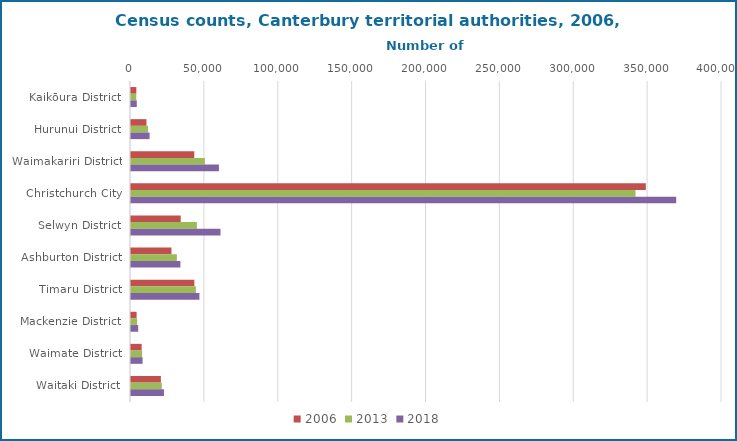
| Category | 2001 | 2006 | 2013 | 2018 |
|---|---|---|---|---|
| Kaikōura District |  | 3621 | 3552 | 3912 |
| Hurunui District |  | 10476 | 11529 | 12558 |
| Waimakariri District |  | 42834 | 49989 | 59502 |
| Christchurch City |  | 348459 | 341472 | 369006 |
| Selwyn District |  | 33642 | 44595 | 60561 |
| Ashburton District |  | 27372 | 31041 | 33423 |
| Timaru District |  | 42870 | 43929 | 46296 |
| Mackenzie District |  | 3804 | 4158 | 4866 |
| Waimate District |  | 7206 | 7536 | 7815 |
| Waitaki District |  | 20223 | 20826 | 22308 |